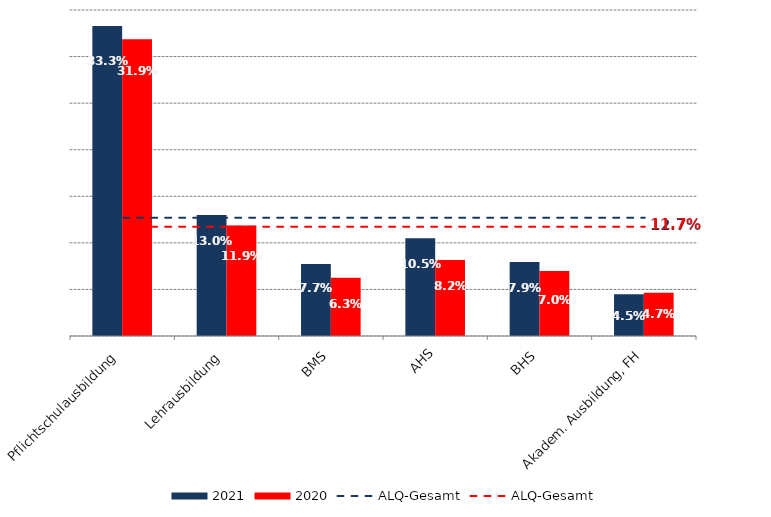
| Category | 2021 | 2020 |
|---|---|---|
| Pflichtschulausbildung | 0.333 | 0.319 |
| Lehrausbildung | 0.13 | 0.119 |
| BMS | 0.077 | 0.063 |
| AHS | 0.105 | 0.082 |
| BHS | 0.079 | 0.07 |
| Akadem. Ausbildung, FH | 0.045 | 0.047 |